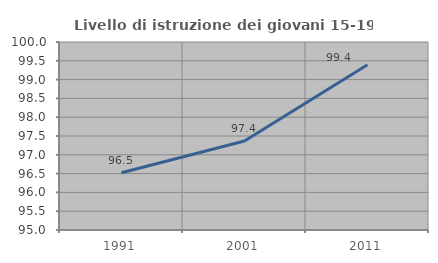
| Category | Livello di istruzione dei giovani 15-19 anni |
|---|---|
| 1991.0 | 96.522 |
| 2001.0 | 97.368 |
| 2011.0 | 99.394 |